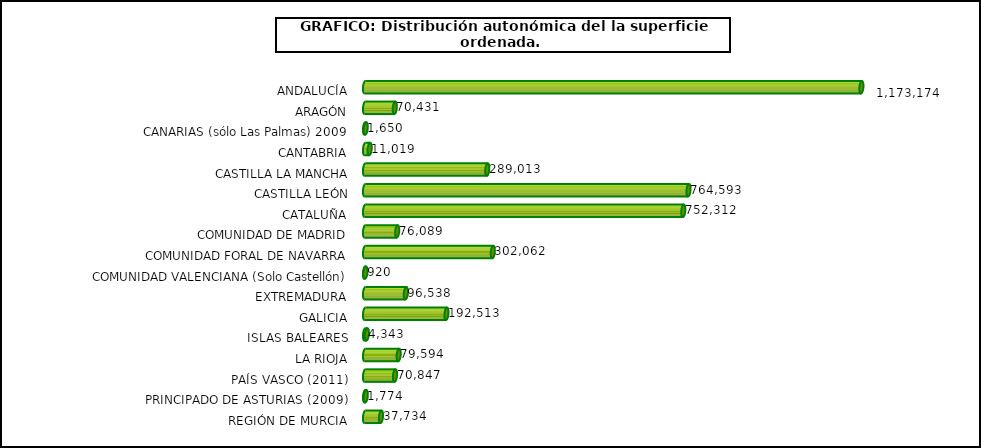
| Category | sup.ordenada |
|---|---|
| ANDALUCÍA | 1173173.56 |
| ARAGÓN | 70430.79 |
| CANARIAS (sólo Las Palmas) 2009 | 1650 |
| CANTABRIA | 11018.84 |
| CASTILLA LA MANCHA | 289013.43 |
| CASTILLA LEÓN | 764593 |
| CATALUÑA | 752311.53 |
| COMUNIDAD DE MADRID | 76088.9 |
| COMUNIDAD FORAL DE NAVARRA | 302061.7 |
| COMUNIDAD VALENCIANA (Solo Castellón) | 920.15 |
| EXTREMADURA | 96537.51 |
| GALICIA | 192512.9 |
| ISLAS BALEARES | 4342.69 |
| LA RIOJA | 79593.96 |
| PAÍS VASCO (2011) | 70847.04 |
| PRINCIPADO DE ASTURIAS (2009) | 1773.86 |
| REGIÓN DE MURCIA | 37733.62 |